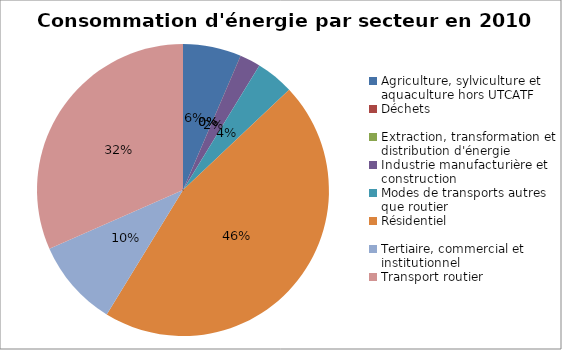
| Category | Series 0 |
|---|---|
| Agriculture, sylviculture et aquaculture hors UTCATF | 38256.191 |
| Déchets | 0 |
| Extraction, transformation et distribution d'énergie | 0 |
| Industrie manufacturière et construction | 13629.167 |
| Modes de transports autres que routier | 24793.504 |
| Résidentiel | 271105.164 |
| Tertiaire, commercial et institutionnel | 57109.937 |
| Transport routier | 187071.619 |